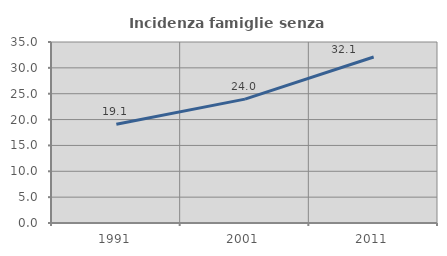
| Category | Incidenza famiglie senza nuclei |
|---|---|
| 1991.0 | 19.09 |
| 2001.0 | 23.958 |
| 2011.0 | 32.106 |